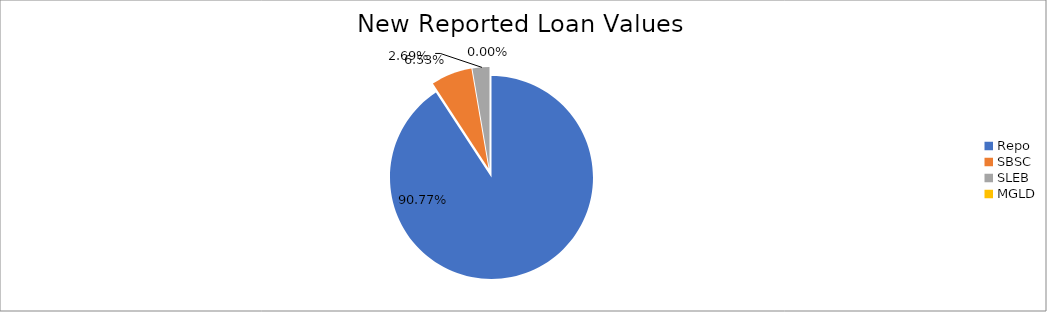
| Category | Series 0 |
|---|---|
| Repo | 10404464.843 |
| SBSC | 748376.746 |
| SLEB | 308840.001 |
| MGLD | 268.846 |